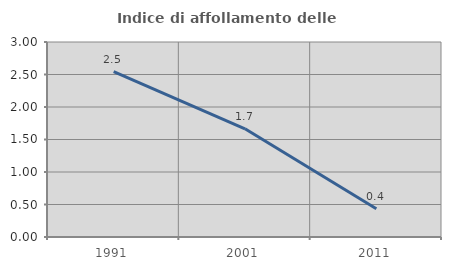
| Category | Indice di affollamento delle abitazioni  |
|---|---|
| 1991.0 | 2.542 |
| 2001.0 | 1.664 |
| 2011.0 | 0.434 |